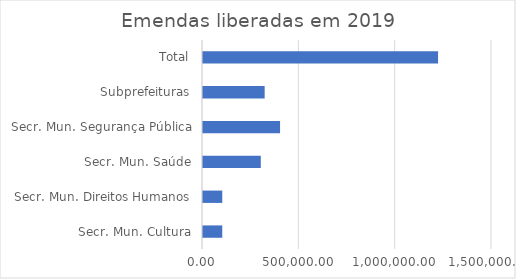
| Category | Series 0 |
|---|---|
| Secr. Mun. Cultura | 100000 |
| Secr. Mun. Direitos Humanos | 100000 |
| Secr. Mun. Saúde | 300000 |
| Secr. Mun. Segurança Pública | 400000 |
| Subprefeituras | 320000 |
| Total | 1220000 |